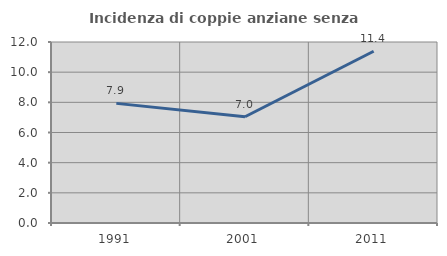
| Category | Incidenza di coppie anziane senza figli  |
|---|---|
| 1991.0 | 7.931 |
| 2001.0 | 7.044 |
| 2011.0 | 11.384 |